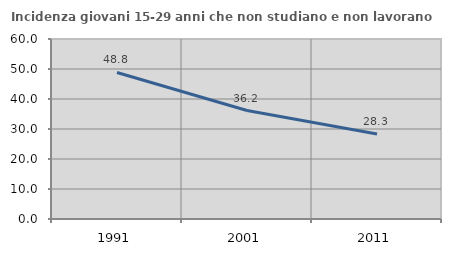
| Category | Incidenza giovani 15-29 anni che non studiano e non lavorano  |
|---|---|
| 1991.0 | 48.837 |
| 2001.0 | 36.165 |
| 2011.0 | 28.305 |